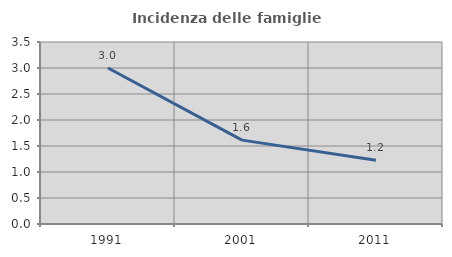
| Category | Incidenza delle famiglie numerose |
|---|---|
| 1991.0 | 3 |
| 2001.0 | 1.613 |
| 2011.0 | 1.224 |